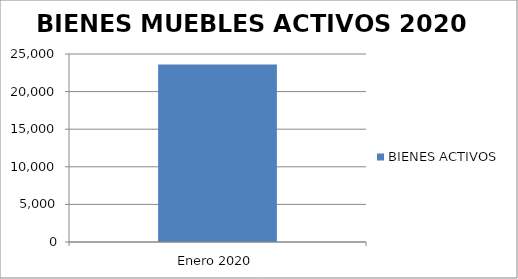
| Category | BIENES ACTIVOS |
|---|---|
| Enero 2020 | 23619 |